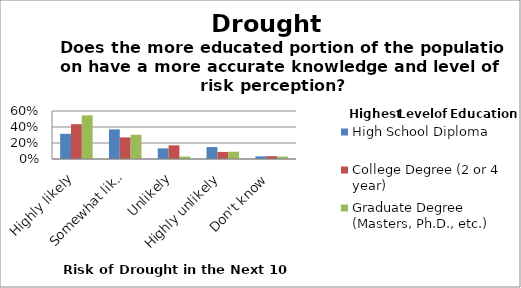
| Category | High School Diploma | College Degree (2 or 4 year) | Graduate Degree (Masters, Ph.D., etc.) |
|---|---|---|---|
| Highly likely | 0.315 | 0.435 | 0.545 |
| Somewhat likely | 0.37 | 0.271 | 0.303 |
| Unlikely | 0.133 | 0.171 | 0.03 |
| Highly unlikely | 0.149 | 0.088 | 0.091 |
| Don't know | 0.033 | 0.035 | 0.03 |